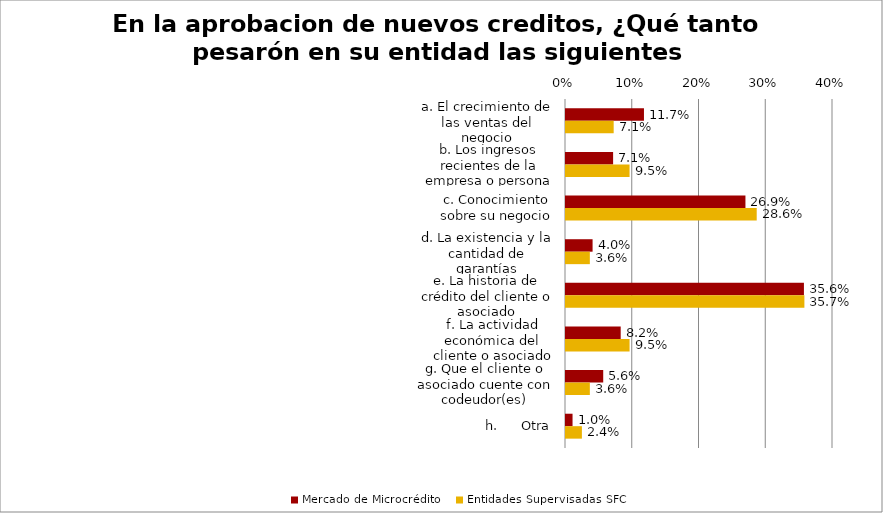
| Category | Mercado de Microcrédito | Entidades Supervisadas SFC |
|---|---|---|
| a. El crecimiento de las ventas del negocio | 0.117 | 0.071 |
| b. Los ingresos recientes de la empresa o persona natural | 0.071 | 0.095 |
| c. Conocimiento sobre su negocio | 0.269 | 0.286 |
| d. La existencia y la cantidad de garantías | 0.04 | 0.036 |
| e. La historia de crédito del cliente o asociado | 0.356 | 0.357 |
| f. La actividad económica del cliente o asociado | 0.082 | 0.095 |
| g. Que el cliente o asociado cuente con codeudor(es) | 0.056 | 0.036 |
| h.      Otra | 0.01 | 0.024 |